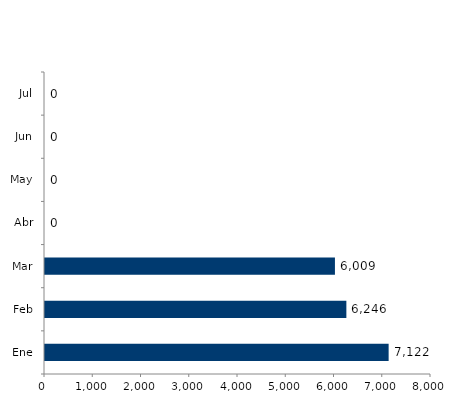
| Category | Series 0 |
|---|---|
| Ene | 7122 |
| Feb | 6246 |
| Mar | 6009 |
| Abr | 0 |
| May | 0 |
| Jun | 0 |
| Jul | 0 |